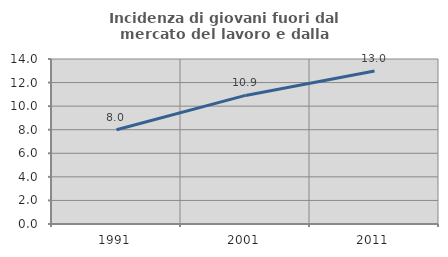
| Category | Incidenza di giovani fuori dal mercato del lavoro e dalla formazione  |
|---|---|
| 1991.0 | 8 |
| 2001.0 | 10.911 |
| 2011.0 | 12.981 |